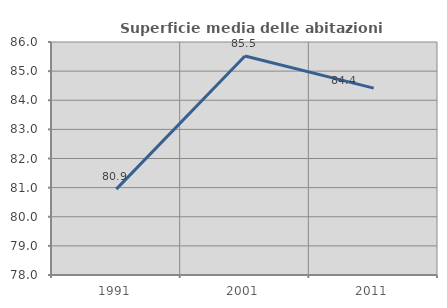
| Category | Superficie media delle abitazioni occupate |
|---|---|
| 1991.0 | 80.95 |
| 2001.0 | 85.517 |
| 2011.0 | 84.415 |